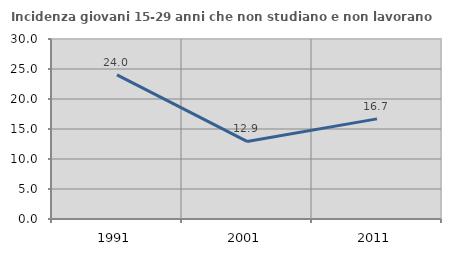
| Category | Incidenza giovani 15-29 anni che non studiano e non lavorano  |
|---|---|
| 1991.0 | 24.016 |
| 2001.0 | 12.924 |
| 2011.0 | 16.686 |